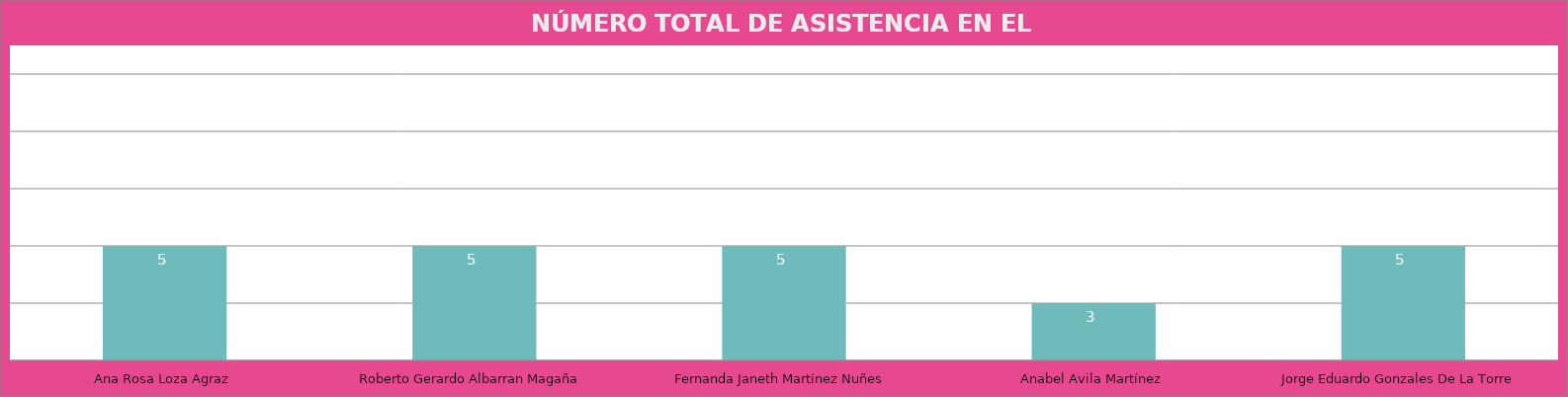
| Category | Ana Rosa Loza Agraz Roberto Gerardo Albarran Magaña Fernanda Janeth Martínez Nuñes Anabel Avila Martínez Jorge Eduardo Gonzales De La Torre |
|---|---|
| Ana Rosa Loza Agraz | 5 |
| Roberto Gerardo Albarran Magaña | 5 |
| Fernanda Janeth Martínez Nuñes | 5 |
| Anabel Avila Martínez | 3 |
| Jorge Eduardo Gonzales De La Torre | 5 |